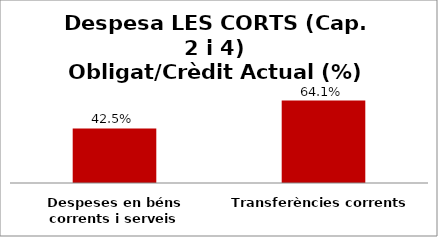
| Category | Series 0 |
|---|---|
| Despeses en béns corrents i serveis | 0.425 |
| Transferències corrents | 0.641 |